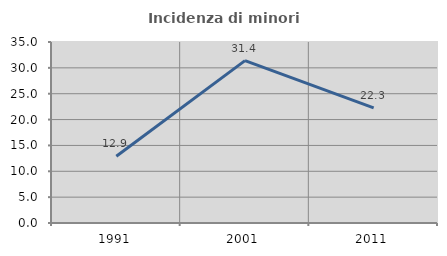
| Category | Incidenza di minori stranieri |
|---|---|
| 1991.0 | 12.903 |
| 2001.0 | 31.401 |
| 2011.0 | 22.277 |